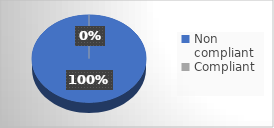
| Category | Series 0 |
|---|---|
| Non compliant | 9 |
| Compliant | 0 |